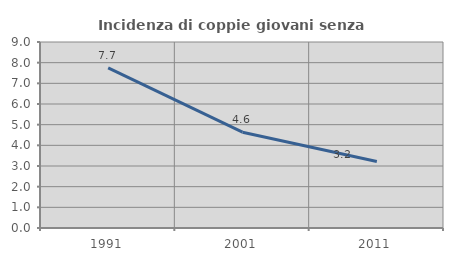
| Category | Incidenza di coppie giovani senza figli |
|---|---|
| 1991.0 | 7.746 |
| 2001.0 | 4.636 |
| 2011.0 | 3.215 |